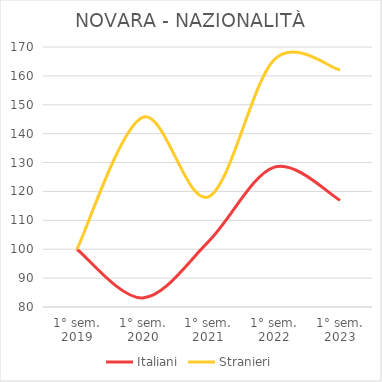
| Category | Italiani | Stranieri |
|---|---|---|
| 1° sem.
2019 | 100 | 100 |
| 1° sem.
2020 | 83.147 | 145.647 |
| 1° sem.
2021 | 102.637 | 118.118 |
| 1° sem.
2022 | 128.419 | 165.627 |
| 1° sem.
2023 | 116.959 | 162.053 |